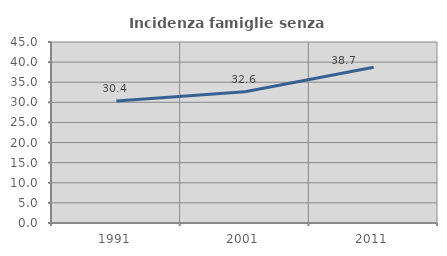
| Category | Incidenza famiglie senza nuclei |
|---|---|
| 1991.0 | 30.36 |
| 2001.0 | 32.644 |
| 2011.0 | 38.716 |